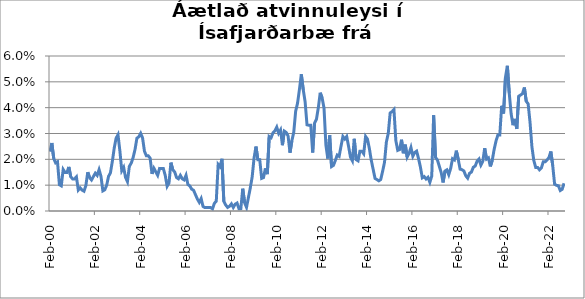
| Category | Series 0 |
|---|---|
| 2000-02-01 | 0.023 |
| 2000-03-01 | 0.026 |
| 2000-04-01 | 0.02 |
| 2000-05-01 | 0.019 |
| 2000-06-01 | 0.019 |
| 2000-07-01 | 0.01 |
| 2000-08-01 | 0.01 |
| 2000-09-01 | 0.016 |
| 2000-10-01 | 0.015 |
| 2000-11-01 | 0.015 |
| 2000-12-01 | 0.017 |
| 2001-01-01 | 0.013 |
| 2001-02-01 | 0.012 |
| 2001-03-01 | 0.012 |
| 2001-04-01 | 0.013 |
| 2001-05-01 | 0.008 |
| 2001-06-01 | 0.009 |
| 2001-07-01 | 0.008 |
| 2001-08-01 | 0.008 |
| 2001-09-01 | 0.01 |
| 2001-10-01 | 0.015 |
| 2001-11-01 | 0.013 |
| 2001-12-01 | 0.012 |
| 2002-01-01 | 0.013 |
| 2002-02-01 | 0.015 |
| 2002-03-01 | 0.014 |
| 2002-04-01 | 0.016 |
| 2002-05-01 | 0.013 |
| 2002-06-01 | 0.008 |
| 2002-07-01 | 0.008 |
| 2002-08-01 | 0.01 |
| 2002-09-01 | 0.013 |
| 2002-10-01 | 0.015 |
| 2002-11-01 | 0.019 |
| 2002-12-01 | 0.024 |
| 2003-01-01 | 0.028 |
| 2003-02-01 | 0.03 |
| 2003-03-01 | 0.023 |
| 2003-04-01 | 0.016 |
| 2003-05-01 | 0.017 |
| 2003-06-01 | 0.013 |
| 2003-07-01 | 0.011 |
| 2003-08-01 | 0.017 |
| 2003-09-01 | 0.019 |
| 2003-10-01 | 0.021 |
| 2003-11-01 | 0.024 |
| 2003-12-01 | 0.028 |
| 2004-01-01 | 0.029 |
| 2004-02-01 | 0.03 |
| 2004-03-01 | 0.028 |
| 2004-04-01 | 0.023 |
| 2004-05-01 | 0.021 |
| 2004-06-01 | 0.021 |
| 2004-07-01 | 0.02 |
| 2004-08-01 | 0.014 |
| 2004-09-01 | 0.017 |
| 2004-10-01 | 0.015 |
| 2004-11-01 | 0.014 |
| 2004-12-01 | 0.016 |
| 2005-01-01 | 0.016 |
| 2005-02-01 | 0.016 |
| 2005-03-01 | 0.014 |
| 2005-04-01 | 0.01 |
| 2005-05-01 | 0.011 |
| 2005-06-01 | 0.019 |
| 2005-07-01 | 0.016 |
| 2005-08-01 | 0.015 |
| 2005-09-01 | 0.013 |
| 2005-10-01 | 0.012 |
| 2005-11-01 | 0.014 |
| 2005-12-01 | 0.012 |
| 2006-01-01 | 0.012 |
| 2006-02-01 | 0.014 |
| 2006-03-01 | 0.01 |
| 2006-04-01 | 0.01 |
| 2006-05-01 | 0.008 |
| 2006-06-01 | 0.008 |
| 2006-07-01 | 0.006 |
| 2006-08-01 | 0.005 |
| 2006-09-01 | 0.003 |
| 2006-10-01 | 0.005 |
| 2006-11-01 | 0.002 |
| 2006-12-01 | 0.001 |
| 2007-01-01 | 0.001 |
| 2007-02-01 | 0.001 |
| 2007-03-01 | 0.001 |
| 2007-04-01 | 0.001 |
| 2007-05-01 | 0.003 |
| 2007-06-01 | 0.004 |
| 2007-07-01 | 0.018 |
| 2007-08-01 | 0.017 |
| 2007-09-01 | 0.02 |
| 2007-10-01 | 0.004 |
| 2007-11-01 | 0.002 |
| 2007-12-01 | 0.001 |
| 2008-01-01 | 0.002 |
| 2008-02-01 | 0.003 |
| 2008-03-01 | 0.001 |
| 2008-04-01 | 0.003 |
| 2008-05-01 | 0.003 |
| 2008-06-01 | 0.001 |
| 2008-07-01 | 0.001 |
| 2008-08-01 | 0.009 |
| 2008-09-01 | 0.003 |
| 2008-10-01 | 0.001 |
| 2008-11-01 | 0.005 |
| 2008-12-01 | 0.009 |
| 2009-01-01 | 0.013 |
| 2009-02-01 | 0.021 |
| 2009-03-01 | 0.025 |
| 2009-04-01 | 0.02 |
| 2009-05-01 | 0.02 |
| 2009-06-01 | 0.013 |
| 2009-07-01 | 0.013 |
| 2009-08-01 | 0.017 |
| 2009-09-01 | 0.014 |
| 2009-10-01 | 0.029 |
| 2009-11-01 | 0.028 |
| 2009-12-01 | 0.03 |
| 2010-01-01 | 0.031 |
| 2010-02-01 | 0.032 |
| 2010-03-01 | 0.03 |
| 2010-04-01 | 0.031 |
| 2010-05-01 | 0.025 |
| 2010-06-01 | 0.031 |
| 2010-07-01 | 0.03 |
| 2010-08-01 | 0.029 |
| 2010-09-01 | 0.023 |
| 2010-10-01 | 0.027 |
| 2010-11-01 | 0.031 |
| 2010-12-01 | 0.039 |
| 2011-01-01 | 0.042 |
| 2011-02-01 | 0.047 |
| 2011-03-01 | 0.053 |
| 2011-04-01 | 0.047 |
| 2011-05-01 | 0.042 |
| 2011-06-01 | 0.033 |
| 2011-07-01 | 0.033 |
| 2011-08-01 | 0.033 |
| 2011-09-01 | 0.023 |
| 2011-10-01 | 0.034 |
| 2011-11-01 | 0.036 |
| 2011-12-01 | 0.04 |
| 2012-01-01 | 0.046 |
| 2012-02-01 | 0.044 |
| 2012-03-01 | 0.04 |
| 2012-04-01 | 0.026 |
| 2012-05-01 | 0.02 |
| 2012-06-01 | 0.029 |
| 2012-07-01 | 0.017 |
| 2012-08-01 | 0.018 |
| 2012-09-01 | 0.02 |
| 2012-10-01 | 0.022 |
| 2012-11-01 | 0.021 |
| 2012-12-01 | 0.025 |
| 2013-01-01 | 0.029 |
| 2013-02-01 | 0.028 |
| 2013-03-01 | 0.029 |
| 2013-04-01 | 0.025 |
| 2013-05-01 | 0.021 |
| 2013-06-01 | 0.019 |
| 2013-07-01 | 0.028 |
| 2013-08-01 | 0.02 |
| 2013-09-01 | 0.019 |
| 2013-10-01 | 0.023 |
| 2013-11-01 | 0.023 |
| 2013-12-01 | 0.022 |
| 2014-01-01 | 0.029 |
| 2014-02-01 | 0.028 |
| 2014-03-01 | 0.024 |
| 2014-04-01 | 0.02 |
| 2014-05-01 | 0.016 |
| 2014-06-01 | 0.013 |
| 2014-07-01 | 0.012 |
| 2014-08-01 | 0.012 |
| 2014-09-01 | 0.012 |
| 2014-10-01 | 0.015 |
| 2014-11-01 | 0.019 |
| 2014-12-01 | 0.027 |
| 2015-01-01 | 0.03 |
| 2015-02-01 | 0.038 |
| 2015-03-01 | 0.038 |
| 2015-04-01 | 0.039 |
| 2015-05-01 | 0.027 |
| 2015-06-01 | 0.023 |
| 2015-07-01 | 0.024 |
| 2015-08-01 | 0.028 |
| 2015-09-01 | 0.022 |
| 2015-10-01 | 0.026 |
| 2015-11-01 | 0.021 |
| 2015-12-01 | 0.022 |
| 2016-01-01 | 0.025 |
| 2016-02-01 | 0.021 |
| 2016-03-01 | 0.023 |
| 2016-04-01 | 0.023 |
| 2016-05-01 | 0.02 |
| 2016-06-01 | 0.017 |
| 2016-07-01 | 0.013 |
| 2016-08-01 | 0.013 |
| 2016-09-01 | 0.012 |
| 2016-10-01 | 0.013 |
| 2016-11-01 | 0.011 |
| 2016-12-01 | 0.014 |
| 2017-01-01 | 0.037 |
| 2017-02-01 | 0.021 |
| 2017-03-01 | 0.02 |
| 2017-04-01 | 0.017 |
| 2017-05-01 | 0.015 |
| 2017-06-01 | 0.011 |
| 2017-07-01 | 0.015 |
| 2017-08-01 | 0.016 |
| 2017-09-01 | 0.014 |
| 2017-10-01 | 0.016 |
| 2017-11-01 | 0.02 |
| 2017-12-01 | 0.02 |
| 2018-01-01 | 0.023 |
| 2018-02-01 | 0.02 |
| 2018-03-01 | 0.016 |
| 2018-04-01 | 0.016 |
| 2018-05-01 | 0.016 |
| 2018-06-01 | 0.014 |
| 2018-07-01 | 0.013 |
| 2018-08-01 | 0.015 |
| 2018-09-01 | 0.015 |
| 2018-10-01 | 0.017 |
| 2018-11-01 | 0.017 |
| 2018-12-01 | 0.019 |
| 2019-01-01 | 0.02 |
| 2019-02-01 | 0.018 |
| 2019-03-01 | 0.019 |
| 2019-04-01 | 0.024 |
| 2019-05-01 | 0.02 |
| 2019-06-01 | 0.021 |
| 2019-07-01 | 0.017 |
| 2019-08-01 | 0.02 |
| 2019-09-01 | 0.024 |
| 2019-10-01 | 0.027 |
| 2019-11-01 | 0.029 |
| 2019-12-01 | 0.029 |
| 2020-01-01 | 0.041 |
| 2020-02-01 | 0.038 |
| 2020-03-01 | 0.052 |
| 2020-04-01 | 0.056 |
| 2020-05-01 | 0.046 |
| 2020-06-01 | 0.038 |
| 2020-07-01 | 0.033 |
| 2020-08-01 | 0.036 |
| 2020-09-01 | 0.032 |
| 2020-10-01 | 0.044 |
| 2020-11-01 | 0.045 |
| 2020-12-01 | 0.045 |
| 2021-01-01 | 0.048 |
| 2021-02-01 | 0.042 |
| 2021-03-01 | 0.041 |
| 2021-04-01 | 0.034 |
| 2021-05-01 | 0.025 |
| 2021-06-01 | 0.02 |
| 2021-07-01 | 0.017 |
| 2021-08-01 | 0.017 |
| 2021-09-01 | 0.016 |
| 2021-10-01 | 0.017 |
| 2021-11-01 | 0.019 |
| 2021-12-01 | 0.019 |
| 2022-01-01 | 0.02 |
| 2022-02-01 | 0.021 |
| 2022-03-01 | 0.023 |
| 2022-04-01 | 0.018 |
| 2022-05-01 | 0.01 |
| 2022-06-01 | 0.01 |
| 2022-07-01 | 0.01 |
| 2022-08-01 | 0.008 |
| 2022-09-01 | 0.008 |
| 2022-10-01 | 0.011 |